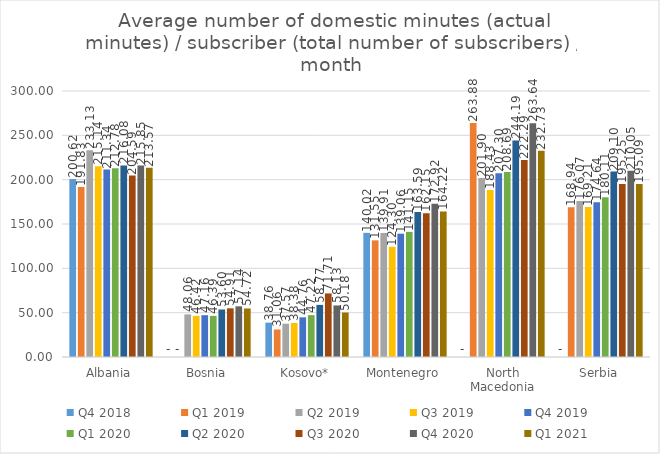
| Category | Q4 2018 | Q1 2019 | Q2 2019 | Q3 2019 | Q4 2019 | Q1 2020 | Q2 2020 | Q3 2020 | Q4 2020 | Q1 2021 |
|---|---|---|---|---|---|---|---|---|---|---|
| Albania | 200.625 | 191.827 | 233.13 | 215.144 | 211.34 | 212.777 | 216.083 | 204.586 | 215.847 | 213.57 |
| Bosnia | 0 | 0 | 48.06 | 46.419 | 47.165 | 46.393 | 53.605 | 54.909 | 57.14 | 54.72 |
| Kosovo* | 38.763 | 31.061 | 37.573 | 38.381 | 44.758 | 47.218 | 58.767 | 71.711 | 58.133 | 50.18 |
| Montenegro | 140.021 | 131.549 | 139.906 | 124.304 | 139.064 | 141.151 | 163.588 | 162.152 | 172.924 | 164.224 |
| North Macedonia | 0 | 263.88 | 201.903 | 188.428 | 207.299 | 208.692 | 244.189 | 222.293 | 263.643 | 232.733 |
| Serbia | 0 | 168.937 | 176.075 | 169.207 | 174.642 | 180.108 | 209.096 | 195.246 | 210.054 | 195.089 |